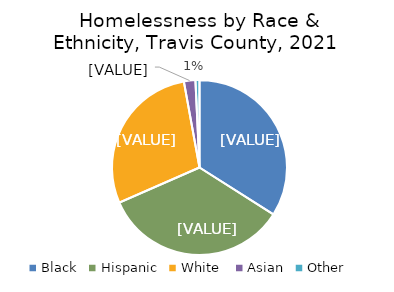
| Category | Series 0 |
|---|---|
| Black | 0.32 |
| Hispanic | 0.324 |
| White  | 0.27 |
| Asian | 0.02 |
| Other | 0.007 |